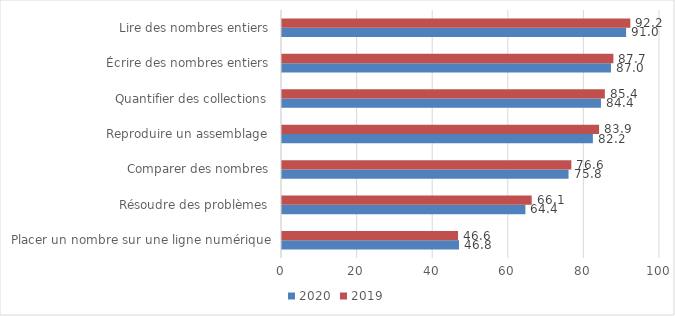
| Category | 2020 | 2019 |
|---|---|---|
| Placer un nombre sur une ligne numérique | 46.83 | 46.57 |
| Résoudre des problèmes | 64.39 | 66.06 |
| Comparer des nombres | 75.81 | 76.55 |
| Reproduire un assemblage | 82.24 | 83.88 |
| Quantifier des collections | 84.38 | 85.41 |
| Écrire des nombres entiers | 87.03 | 87.67 |
| Lire des nombres entiers | 91.03 | 92.15 |